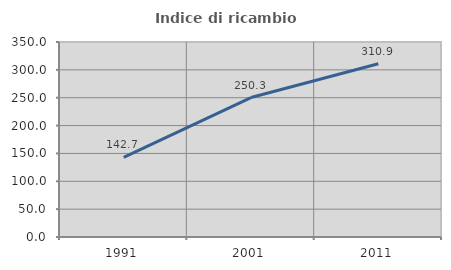
| Category | Indice di ricambio occupazionale  |
|---|---|
| 1991.0 | 142.731 |
| 2001.0 | 250.34 |
| 2011.0 | 310.884 |